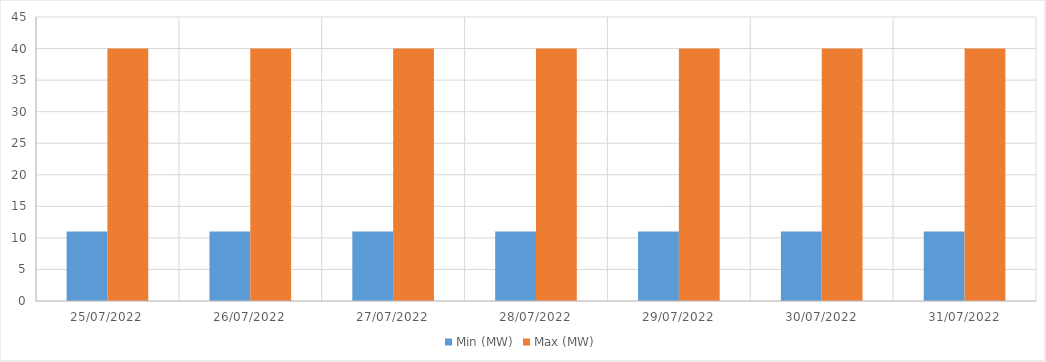
| Category | Min (MW) | Max (MW) |
|---|---|---|
| 25/07/2022 | 11 | 40 |
| 26/07/2022 | 11 | 40 |
| 27/07/2022 | 11 | 40 |
| 28/07/2022 | 11 | 40 |
| 29/07/2022 | 11 | 40 |
| 30/07/2022 | 11 | 40 |
| 31/07/2022 | 11 | 40 |